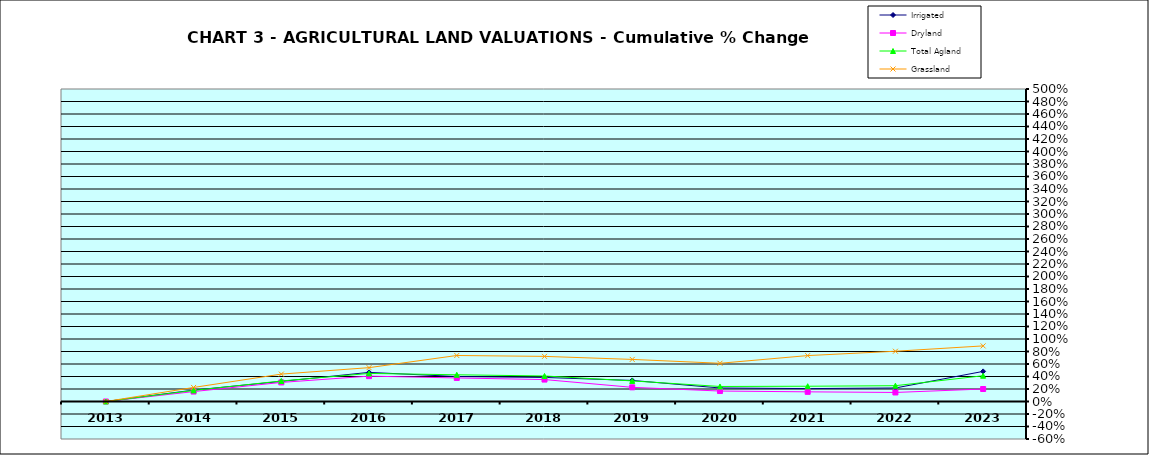
| Category | Irrigated | Dryland | Total Agland | Grassland |
|---|---|---|---|---|
| 2013.0 | 0 | 0 | 0 | 0 |
| 2014.0 | 0.182 | 0.159 | 0.177 | 0.225 |
| 2015.0 | 0.321 | 0.305 | 0.328 | 0.438 |
| 2016.0 | 0.466 | 0.406 | 0.449 | 0.542 |
| 2017.0 | 0.399 | 0.377 | 0.427 | 0.736 |
| 2018.0 | 0.385 | 0.351 | 0.408 | 0.722 |
| 2019.0 | 0.337 | 0.227 | 0.329 | 0.673 |
| 2020.0 | 0.216 | 0.167 | 0.24 | 0.612 |
| 2021.0 | 0.206 | 0.155 | 0.244 | 0.735 |
| 2022.0 | 0.216 | 0.145 | 0.253 | 0.804 |
| 2023.0 | 0.482 | 0.2 | 0.412 | 0.89 |